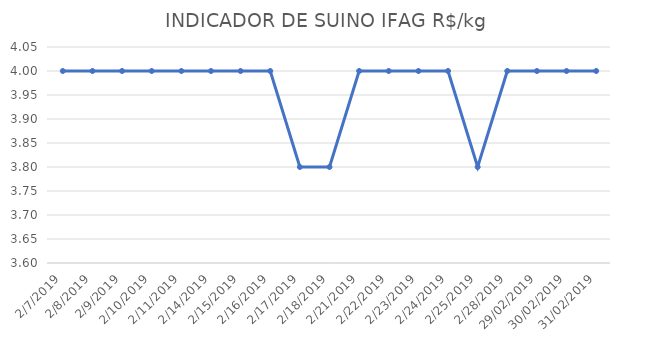
| Category | INDICADOR DE SUINO IFAG |
|---|---|
| 07/02/2019 | 4 |
| 08/02/2019 | 4 |
| 09/02/2019 | 4 |
| 10/02/2019 | 4 |
| 11/02/2019 | 4 |
| 14/02/2019 | 4 |
| 15/02/2019 | 4 |
| 16/02/2019 | 4 |
| 17/02/2019 | 3.8 |
| 18/02/2019 | 3.8 |
| 21/02/2019 | 4 |
| 22/02/2019 | 4 |
| 23/02/2019 | 4 |
| 24/02/2019 | 4 |
| 25/02/2019 | 3.8 |
| 28/02/2019 | 4 |
| 29/02/2019 | 4 |
| 30/02/2019 | 4 |
| 31/02/2019 | 4 |